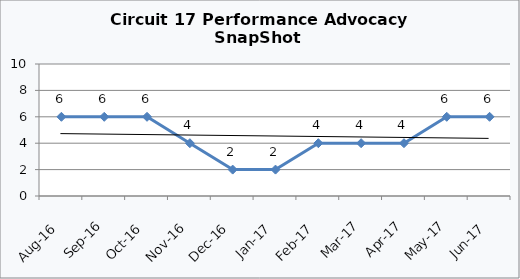
| Category | Circuit 17 |
|---|---|
| Aug-16 | 6 |
| Sep-16 | 6 |
| Oct-16 | 6 |
| Nov-16 | 4 |
| Dec-16 | 2 |
| Jan-17 | 2 |
| Feb-17 | 4 |
| Mar-17 | 4 |
| Apr-17 | 4 |
| May-17 | 6 |
| Jun-17 | 6 |